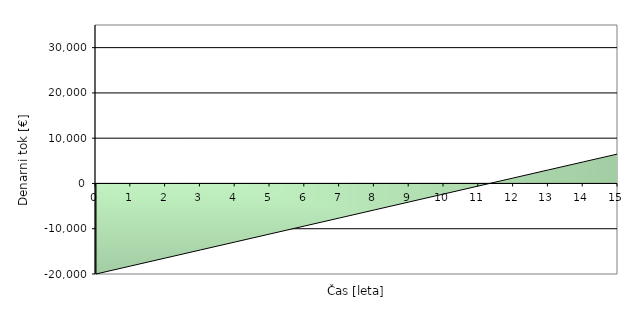
| Category | Series 0 |
|---|---|
| 0.0 | -20000 |
| 1.0 | -18231.571 |
| 2.0 | -16463.141 |
| 3.0 | -14694.712 |
| 4.0 | -12926.282 |
| 5.0 | -11157.853 |
| 6.0 | -9389.424 |
| 7.0 | -7620.994 |
| 8.0 | -5852.565 |
| 9.0 | -4084.135 |
| 10.0 | -2315.706 |
| 11.0 | -547.277 |
| 12.0 | 1221.153 |
| 13.0 | 2989.582 |
| 14.0 | 4758.012 |
| 15.0 | 6526.441 |